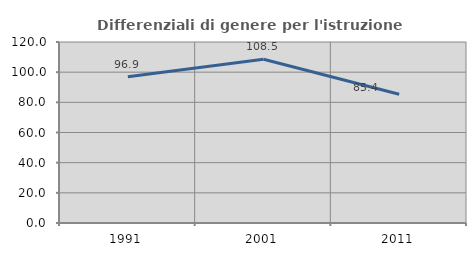
| Category | Differenziali di genere per l'istruzione superiore |
|---|---|
| 1991.0 | 96.937 |
| 2001.0 | 108.545 |
| 2011.0 | 85.384 |